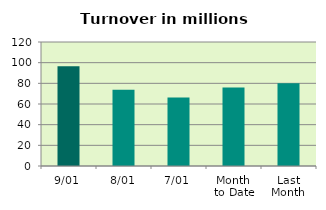
| Category | Series 0 |
|---|---|
| 9/01 | 96.439 |
| 8/01 | 73.68 |
| 7/01 | 66.209 |
| Month 
to Date | 75.915 |
| Last
Month | 79.992 |